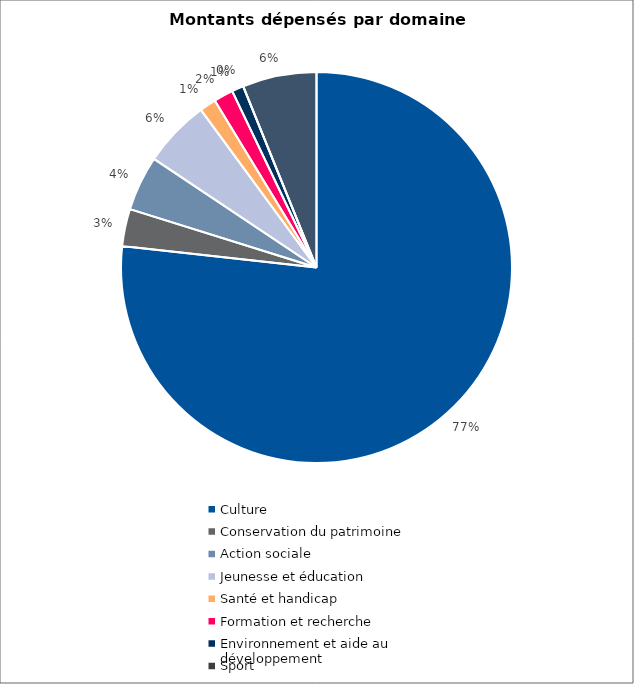
| Category | Series 0 |
|---|---|
| Culture | 9738247 |
| Conservation du patrimoine | 390500 |
| Action sociale | 577165 |
| Jeunesse et éducation | 705000 |
| Santé et handicap | 172500 |
| Formation et recherche | 205000 |
| Environnement et aide au
développement | 124000 |
| Sport | 0 |
| Autres projets d’utilité publique | 776286 |